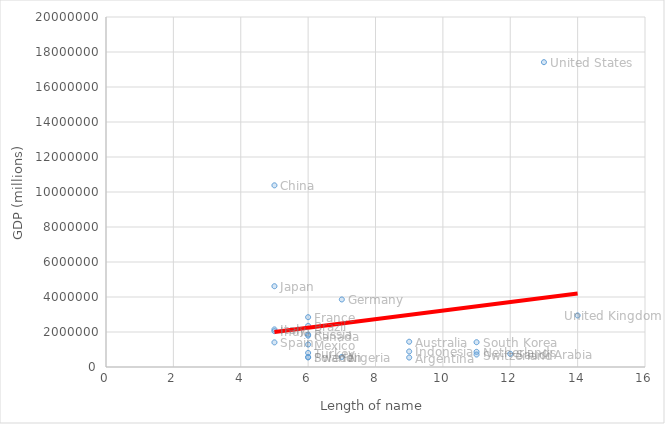
| Category | Series 0 |
|---|---|
| 13.0 | 17418925 |
| 5.0 | 10380380 |
| 5.0 | 4616335 |
| 7.0 | 3859547 |
| 14.0 | 2945146 |
| 6.0 | 2846889 |
| 6.0 | 2353025 |
| 5.0 | 2147952 |
| 5.0 | 2049501 |
| 6.0 | 1857461 |
| 6.0 | 1788717 |
| 9.0 | 1444189 |
| 11.0 | 1416949 |
| 5.0 | 1406855 |
| 6.0 | 1282725 |
| 9.0 | 888648 |
| 11.0 | 866354 |
| 6.0 | 806108 |
| 12.0 | 752459 |
| 11.0 | 712050 |
| 7.0 | 573652 |
| 6.0 | 570137 |
| 6.0 | 546644 |
| 9.0 | 540164 |